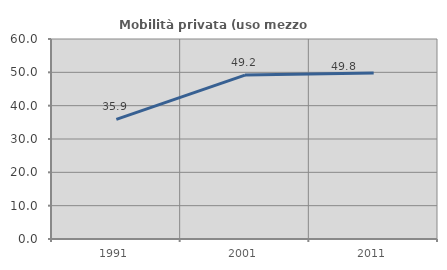
| Category | Mobilità privata (uso mezzo privato) |
|---|---|
| 1991.0 | 35.897 |
| 2001.0 | 49.167 |
| 2011.0 | 49.799 |